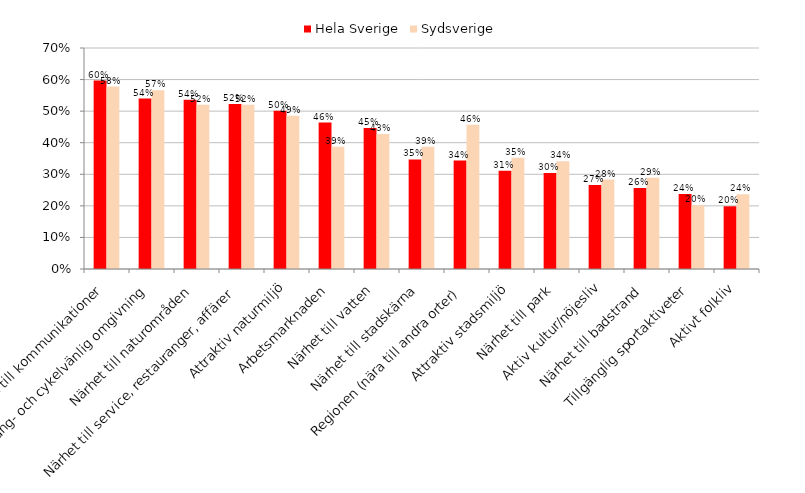
| Category | Hela Sverige | Sydsverige |
|---|---|---|
| Närhet till kommunikationer | 0.597 | 0.578 |
| Gång- och cykelvänlig omgivning | 0.54 | 0.566 |
| Närhet till naturområden | 0.536 | 0.52 |
| Närhet till service, restauranger, affärer | 0.523 | 0.52 |
| Attraktiv naturmiljö | 0.501 | 0.486 |
| Arbetsmarknaden | 0.464 | 0.387 |
| Närhet till vatten | 0.446 | 0.428 |
| Närhet till stadskärna | 0.347 | 0.387 |
| Regionen (nära till andra orter) | 0.343 | 0.457 |
|  Attraktiv stadsmiljö | 0.311 | 0.353 |
| Närhet till park | 0.304 | 0.341 |
| Aktiv kultur/nöjesliv | 0.266 | 0.283 |
| Närhet till badstrand | 0.257 | 0.289 |
| Tillgänglig sportaktiveter | 0.237 | 0.202 |
| Aktivt folkliv | 0.199 | 0.237 |